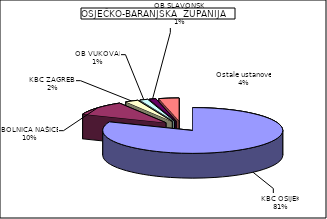
| Category | Series 0 |
|---|---|
| KBC OSIJEK | 81.152 |
| BOLNICA NAŠICE | 10.205 |
| KBC ZAGREB  | 2.369 |
| OB VUKOVAR | 1.462 |
| OB SLAVONSKI BROD | 1.191 |
| Ostale ustanove | 3.621 |